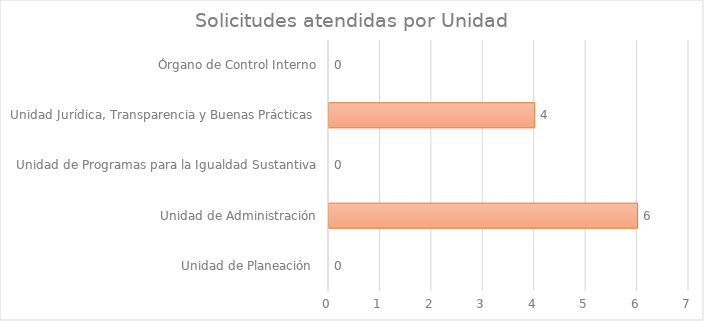
| Category | Series 1 |
|---|---|
| Unidad de Planeación  | 0 |
| Unidad de Administración | 6 |
| Unidad de Programas para la Igualdad Sustantiva | 0 |
| Unidad Jurídica, Transparencia y Buenas Prácticas  | 4 |
| Órgano de Control Interno | 0 |